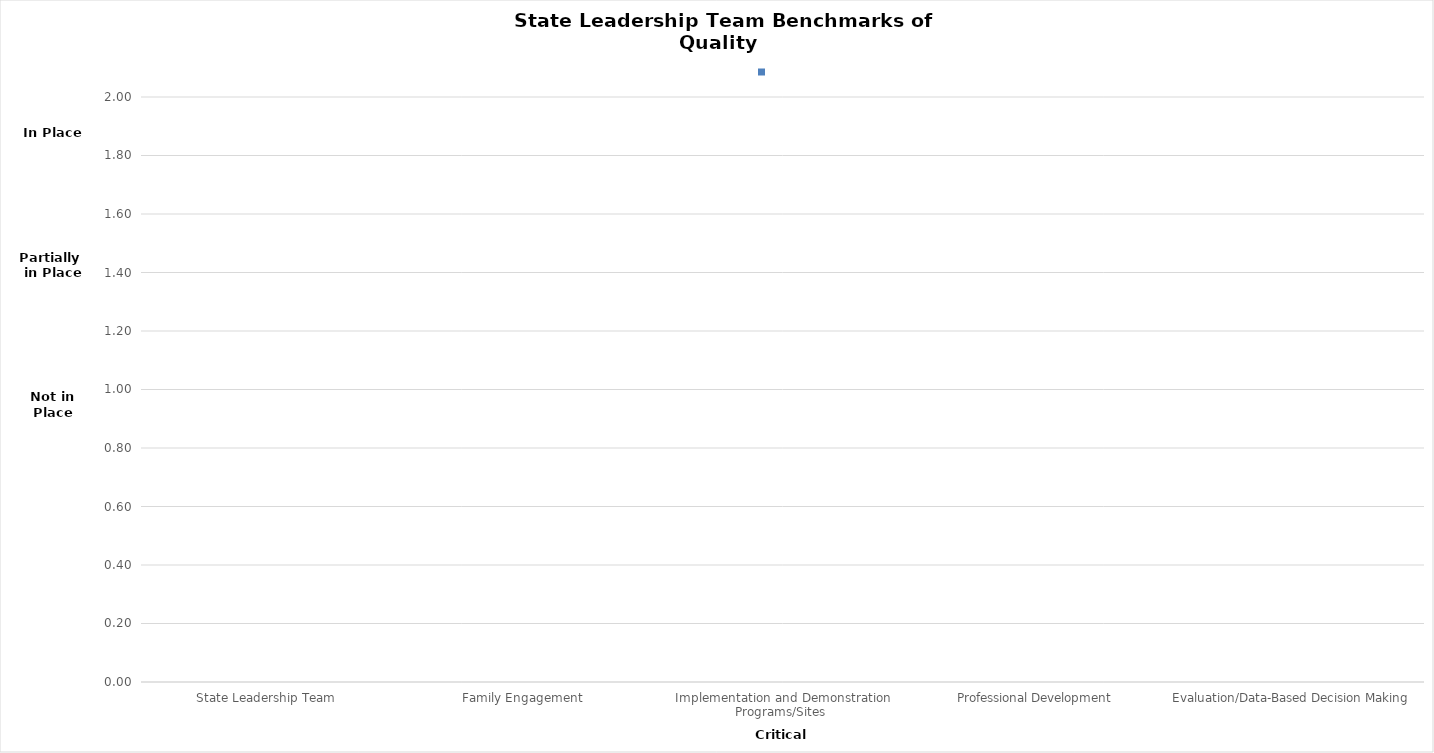
| Category | Series 0 |
|---|---|
| State Leadership Team  | 0 |
| Family Engagement  | 0 |
| Implementation and Demonstration Programs/Sites  | 0 |
| Professional Development  | 0 |
| Evaluation/Data-Based Decision Making  | 0 |